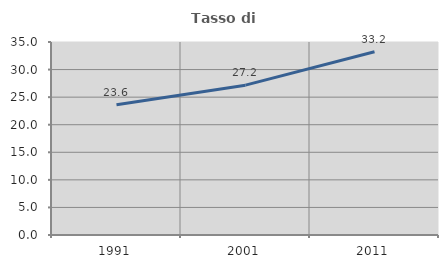
| Category | Tasso di occupazione   |
|---|---|
| 1991.0 | 23.611 |
| 2001.0 | 27.174 |
| 2011.0 | 33.24 |